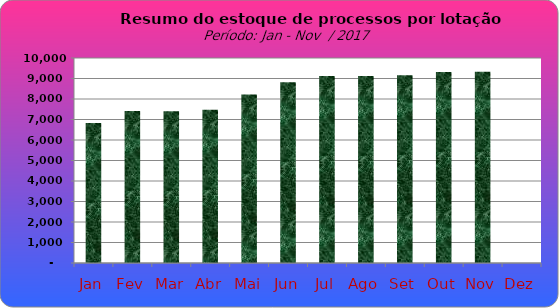
| Category | Series 0 |
|---|---|
| Jan | 6829 |
| Fev | 7414 |
| Mar | 7401 |
| Abr | 7477 |
| Mai | 8225 |
| Jun | 8821 |
| Jul | 9119 |
| Ago | 9128 |
| Set | 9158 |
| Out | 9323 |
| Nov | 9335 |
| Dez | 0 |